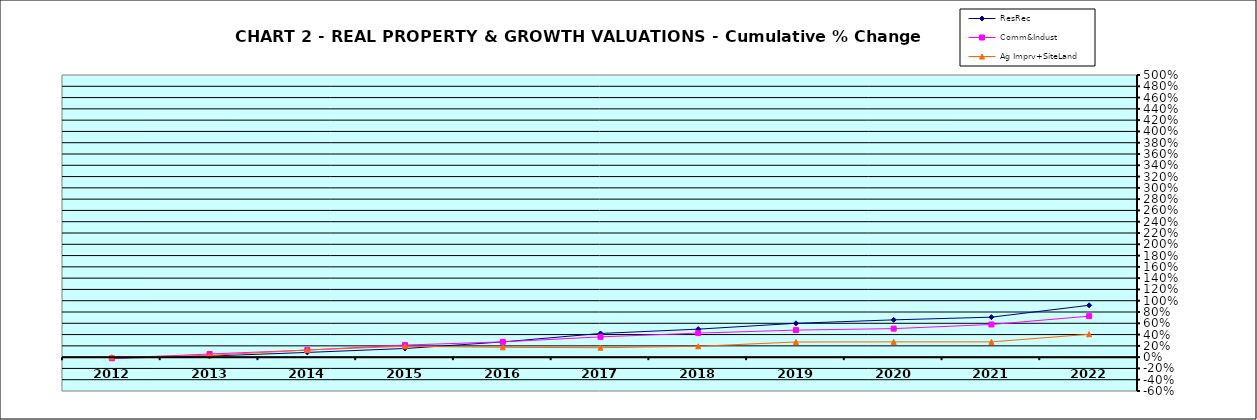
| Category | ResRec | Comm&Indust | Ag Imprv+SiteLand |
|---|---|---|---|
| 2012.0 | -0.02 | -0.021 | 0 |
| 2013.0 | 0.019 | 0.056 | 0.03 |
| 2014.0 | 0.084 | 0.125 | 0.128 |
| 2015.0 | 0.153 | 0.214 | 0.192 |
| 2016.0 | 0.27 | 0.271 | 0.174 |
| 2017.0 | 0.419 | 0.359 | 0.167 |
| 2018.0 | 0.496 | 0.426 | 0.193 |
| 2019.0 | 0.6 | 0.479 | 0.268 |
| 2020.0 | 0.661 | 0.505 | 0.27 |
| 2021.0 | 0.708 | 0.579 | 0.27 |
| 2022.0 | 0.919 | 0.726 | 0.405 |